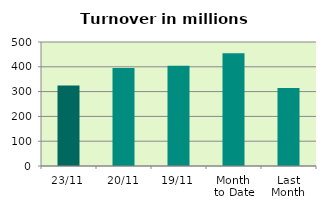
| Category | Series 0 |
|---|---|
| 23/11 | 324.904 |
| 20/11 | 395.637 |
| 19/11 | 403.753 |
| Month 
to Date | 454.545 |
| Last
Month | 314.143 |